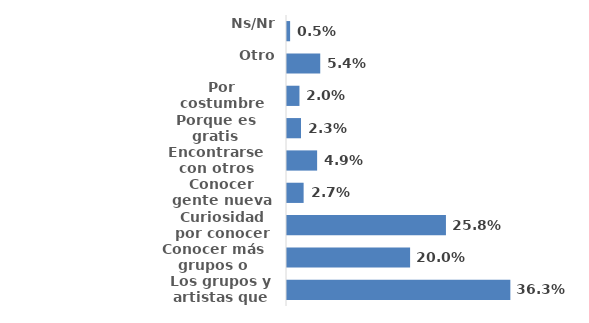
| Category | Series 0 |
|---|---|
| Los grupos y artistas que se presentan | 0.363 |
| Conocer más grupos o bandas  | 0.2 |
| Curiosidad por conocer este festival | 0.258 |
| Conocer gente nueva | 0.027 |
| Encontrarse con otros amigos | 0.049 |
| Porque es gratis | 0.023 |
| Por costumbre | 0.02 |
| Otro | 0.054 |
| Ns/Nr | 0.005 |